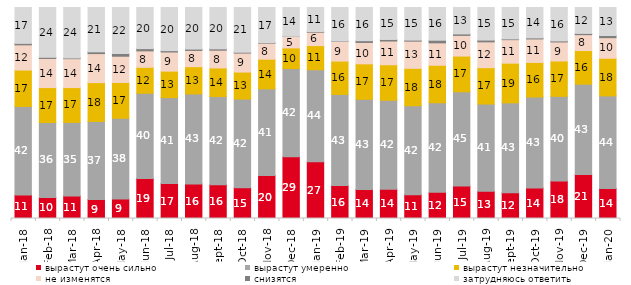
| Category | вырастут очень сильно | вырастут умеренно | вырастут незначительно | не изменятся | снизятся | затрудняюсь ответить |
|---|---|---|---|---|---|---|
| 2018-01-01 | 11.1 | 42 | 17.25 | 11.95 | 0.7 | 17 |
| 2018-02-01 | 10 | 35.5 | 16.55 | 13.8 | 0.55 | 23.6 |
| 2018-03-01 | 10.65 | 34.9 | 16.5 | 13.7 | 0.35 | 23.9 |
| 2018-04-01 | 8.95 | 37.05 | 18.4 | 13.75 | 0.85 | 21 |
| 2018-05-01 | 9.3 | 38.2 | 16.95 | 12.45 | 1.3 | 21.8 |
| 2018-06-01 | 18.95 | 40.4 | 12.3 | 7.8 | 1.05 | 19.5 |
| 2018-07-01 | 16.55 | 40.75 | 12.55 | 9.05 | 0.65 | 20.45 |
| 2018-08-01 | 16.35 | 42.7 | 12.9 | 7.7 | 0.65 | 19.7 |
| 2018-09-01 | 16.05 | 41.75 | 13.55 | 8.4 | 0.65 | 19.6 |
| 2018-10-01 | 14.6 | 42 | 12.8 | 9 | 0.4 | 21.2 |
| 2018-11-01 | 20.359 | 41.068 | 14.072 | 7.585 | 0.25 | 16.667 |
| 2018-12-01 | 29.25 | 41.8 | 9.8 | 5.4 | 0.1 | 13.65 |
| 2019-01-01 | 26.85 | 43.65 | 11.45 | 6.35 | 0.3 | 11.4 |
| 2019-02-01 | 15.6 | 43.2 | 15.8 | 9.35 | 0.15 | 15.9 |
| 2019-03-01 | 13.774 | 42.715 | 16.808 | 10.144 | 0.845 | 15.714 |
| 2019-04-01 | 13.911 | 42.129 | 16.832 | 11.238 | 0.743 | 15.149 |
| 2019-05-01 | 11.293 | 42.15 | 17.732 | 12.878 | 0.495 | 15.453 |
| 2019-06-01 | 12.419 | 42.444 | 17.756 | 10.623 | 1.247 | 15.511 |
| 2019-07-01 | 15.396 | 44.653 | 16.931 | 9.802 | 0.693 | 12.525 |
| 2019-08-01 | 12.887 | 41.359 | 17.233 | 12.238 | 0.849 | 15.435 |
| 2019-09-01 | 12.228 | 42.574 | 18.812 | 11.139 | 0.347 | 14.901 |
| 2019-10-01 | 14.455 | 43.119 | 16.386 | 11.139 | 0.495 | 14.406 |
| 2019-11-01 | 17.772 | 40.099 | 16.782 | 9.01 | 0.495 | 15.842 |
| 2019-12-01 | 20.891 | 42.772 | 15.941 | 7.525 | 0.594 | 12.277 |
| 2020-01-01 | 14.208 | 43.911 | 17.822 | 9.752 | 1.04 | 13.267 |